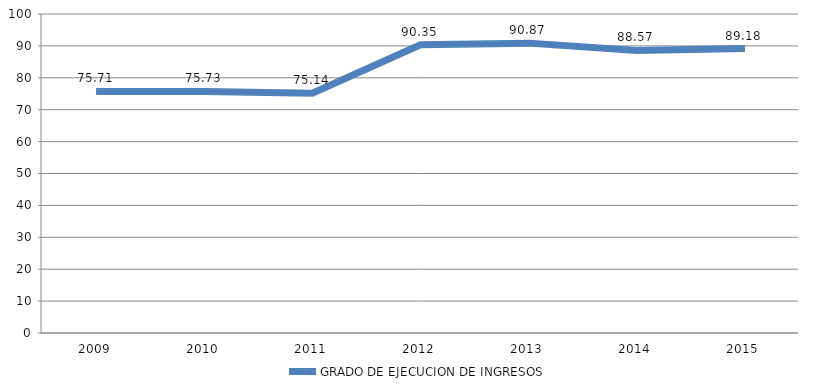
| Category | GRADO DE EJECUCION DE INGRESOS |
|---|---|
| 2009.0 | 75.713 |
| 2010.0 | 75.729 |
| 2011.0 | 75.141 |
| 2012.0 | 90.35 |
| 2013.0 | 90.869 |
| 2014.0 | 88.568 |
| 2015.0 | 89.179 |